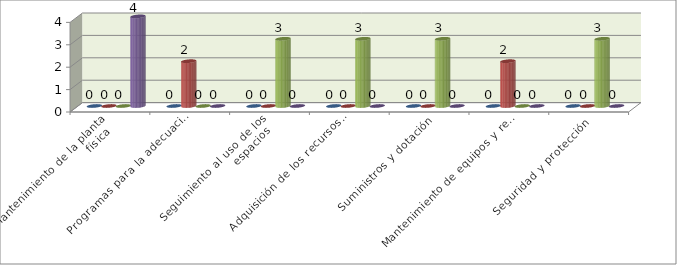
| Category | Series 0 | Series 1 | Series 2 | Series 3 |
|---|---|---|---|---|
| Mantenimiento de la planta
física | 0 | 0 | 0 | 4 |
| Programas para la adecuación y
embellecimiento de la planta física | 0 | 2 | 0 | 0 |
| Seguimiento al uso de los
espacios | 0 | 0 | 3 | 0 |
| Adquisición de los recursos
para el aprendizaje | 0 | 0 | 3 | 0 |
| Suministros y dotación | 0 | 0 | 3 | 0 |
| Mantenimiento de equipos y recursos para el aprendizaje  | 0 | 2 | 0 | 0 |
| Seguridad y protección | 0 | 0 | 3 | 0 |